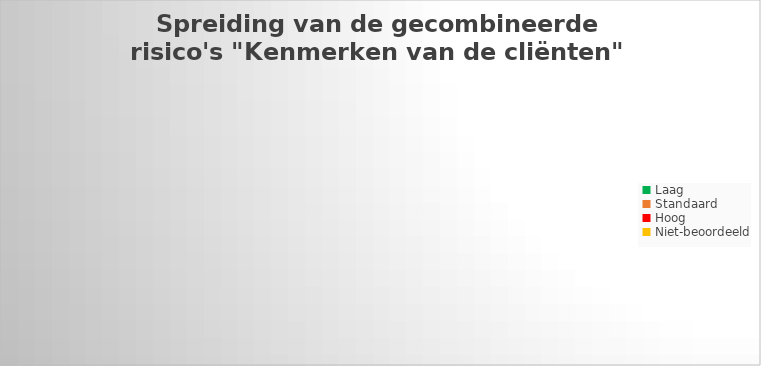
| Category | Series 1 |
|---|---|
| Laag | 0 |
| Standaard | 0 |
| Hoog | 0 |
| Niet-beoordeeld | 0 |